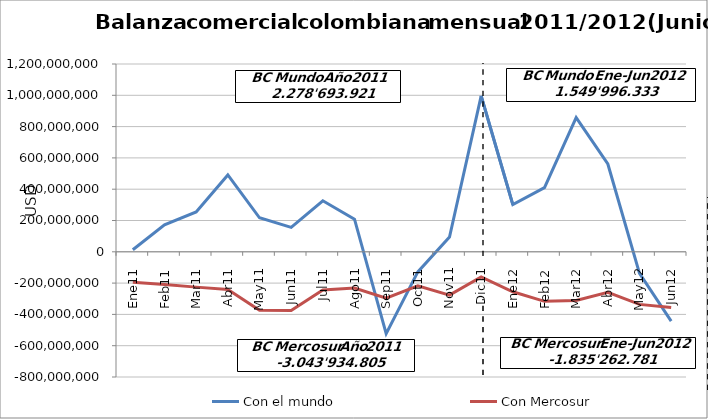
| Category | Con el mundo | Con Mercosur |
|---|---|---|
| 0 | 12976228.07 | -194557946.35 |
| 1 | 172080876.66 | -208172919.61 |
| 2 | 254737279.24 | -225722527.93 |
| 3 | 491095442.31 | -240665398.33 |
| 4 | 217317087.62 | -372945892 |
| 5 | 156393086.3 | -375724306.81 |
| 6 | 326134966.39 | -244036756.53 |
| 7 | 208345592.97 | -231053296.47 |
| 8 | -522891907.61 | -296291489.17 |
| 9 | -128564369.04 | -216915087.94 |
| 10 | 94315805.83 | -276900600.66 |
| 11 | 996753832.74 | -160948582.92 |
| 12 | 301773207.39 | -255250526.31 |
| 13 | 410189041.25 | -316731826.82 |
| 14 | 857833423.7 | -311092353.91 |
| 15 | 561075382.57 | -259531709.66 |
| 16 | -138077862.03 | -336089619.79 |
| 17 | -442796860.29 | -356566744.71 |